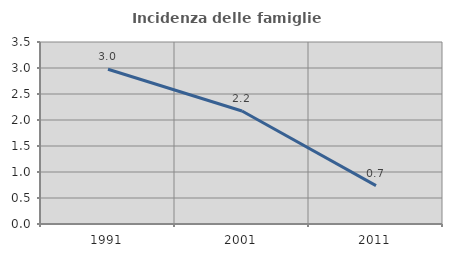
| Category | Incidenza delle famiglie numerose |
|---|---|
| 1991.0 | 2.976 |
| 2001.0 | 2.172 |
| 2011.0 | 0.738 |